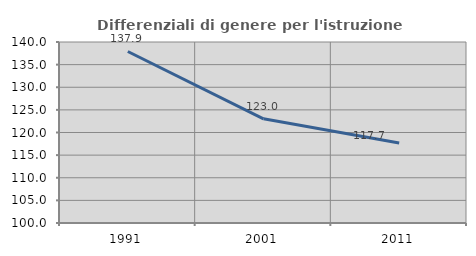
| Category | Differenziali di genere per l'istruzione superiore |
|---|---|
| 1991.0 | 137.906 |
| 2001.0 | 123.024 |
| 2011.0 | 117.688 |